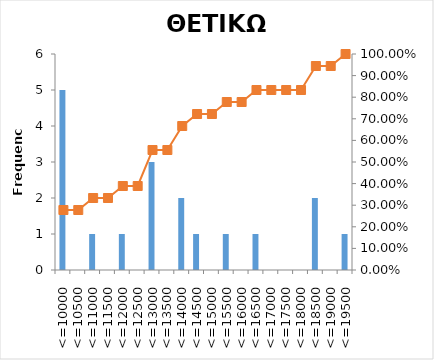
| Category | Series 0 |
|---|---|
| <=10000 | 5 |
| <=10500 | 0 |
| <=11000 | 1 |
| <=11500 | 0 |
| <=12000 | 1 |
| <=12500 | 0 |
| <=13000 | 3 |
| <=13500 | 0 |
| <=14000 | 2 |
| <=14500 | 1 |
| <=15000 | 0 |
| <=15500 | 1 |
| <=16000 | 0 |
| <=16500 | 1 |
| <=17000 | 0 |
| <=17500 | 0 |
| <=18000 | 0 |
| <=18500 | 2 |
| <=19000 | 0 |
| <=19500 | 1 |